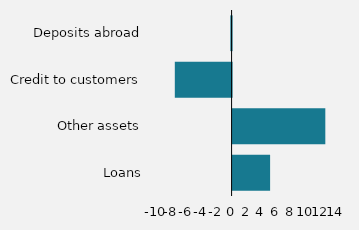
| Category | Series 0 |
|---|---|
| Loans | 5031 |
| Other assets | 12434 |
| Credit to customers | -7612 |
| Deposits abroad | -168 |